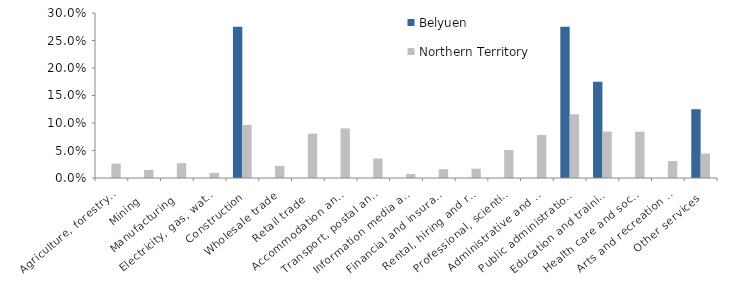
| Category | Belyuen | Northern Territory |
|---|---|---|
| Agriculture, forestry and fishing | 0 | 0.026 |
| Mining | 0 | 0.015 |
| Manufacturing | 0 | 0.027 |
| Electricity, gas, water and waste services | 0 | 0.009 |
| Construction | 0.275 | 0.097 |
| Wholesale trade | 0 | 0.022 |
| Retail trade | 0 | 0.081 |
| Accommodation and food services | 0 | 0.09 |
| Transport, postal and warehousing | 0 | 0.035 |
| Information media and telecommunications | 0 | 0.007 |
| Financial and insurance services | 0 | 0.016 |
| Rental, hiring and real estate services | 0 | 0.017 |
| Professional, scientific and technical services | 0 | 0.051 |
| Administrative and support services | 0 | 0.078 |
| Public administration and safety | 0.275 | 0.116 |
| Education and training | 0.175 | 0.084 |
| Health care and social assistance | 0 | 0.084 |
| Arts and recreation services | 0 | 0.031 |
| Other services | 0.125 | 0.045 |